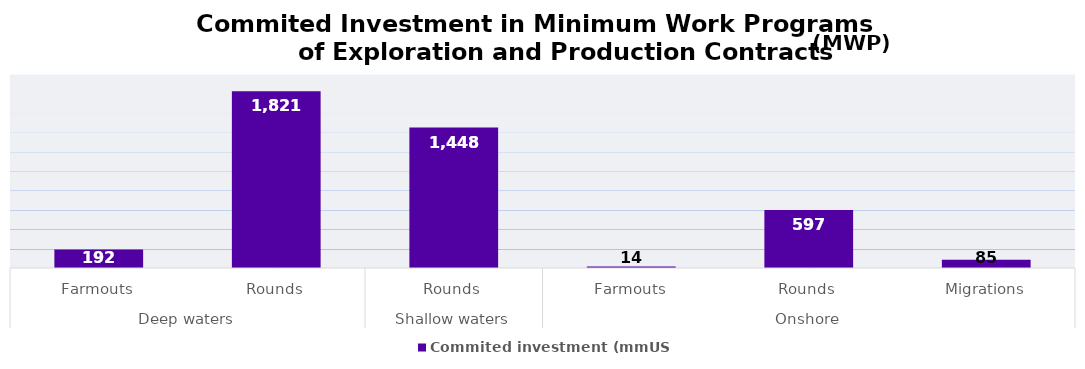
| Category | Commited investment (mmUSD) |
|---|---|
| 0 | 191.734 |
| 1 | 1821.38 |
| 2 | 1448.16 |
| 3 | 14.231 |
| 4 | 597.408 |
| 5 | 84.793 |